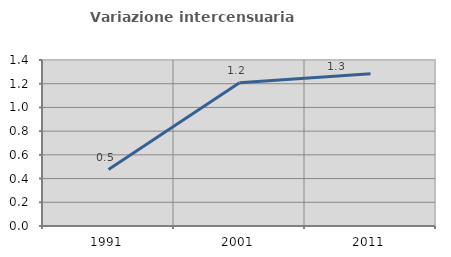
| Category | Variazione intercensuaria annua |
|---|---|
| 1991.0 | 0.476 |
| 2001.0 | 1.207 |
| 2011.0 | 1.283 |